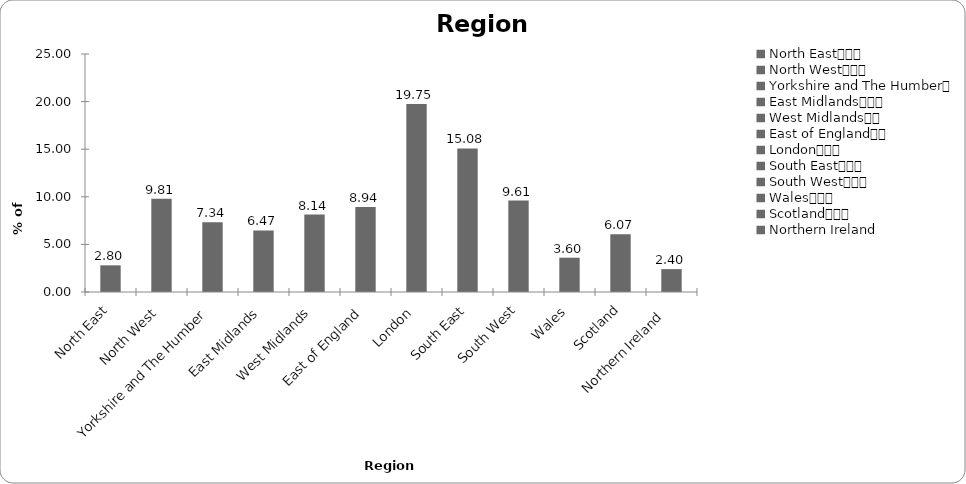
| Category | Region |
|---|---|
| North East			 | 2.802 |
| North West			 | 9.807 |
| Yorkshire and The Humber	 | 7.338 |
| East Midlands			 | 6.471 |
| West Midlands		 | 8.139 |
| East of England		 | 8.939 |
| London			 | 19.746 |
| South East			 | 15.077 |
| South West			 | 9.606 |
| Wales			 | 3.602 |
| Scotland			 | 6.071 |
| Northern Ireland  | 2.402 |